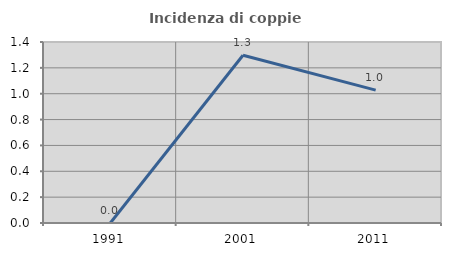
| Category | Incidenza di coppie miste |
|---|---|
| 1991.0 | 0 |
| 2001.0 | 1.297 |
| 2011.0 | 1.028 |